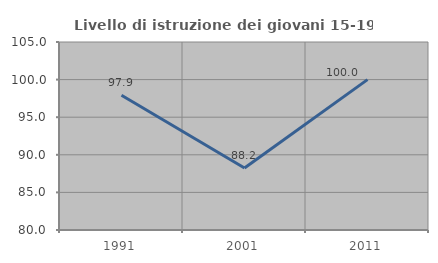
| Category | Livello di istruzione dei giovani 15-19 anni |
|---|---|
| 1991.0 | 97.917 |
| 2001.0 | 88.235 |
| 2011.0 | 100 |